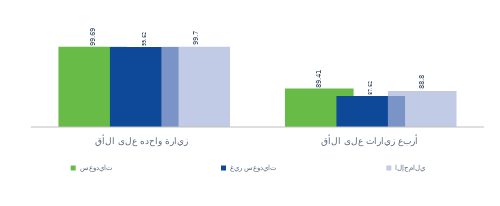
| Category | سعوديات | غير سعوديات | الإجمالي |
|---|---|---|---|
| زيارة واحده على الأقل | 99.693 | 99.624 | 99.67 |
|  أربع زيارات على الأقل | 89.411 | 87.619 | 88.809 |